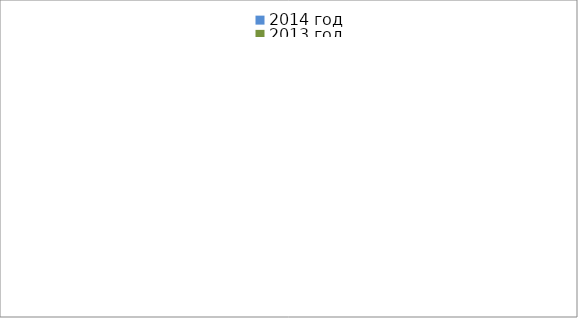
| Category | 2014 год | 2013 год |
|---|---|---|
|  - поджог | 17 | 31 |
|  - неосторожное обращение с огнём | 32 | 44 |
|  - НПТЭ электрооборудования | 17 | 20 |
|  - НПУ и Э печей | 53 | 40 |
|  - НПУ и Э транспортных средств | 49 | 51 |
|   -Шалость с огнем детей | 0 | 3 |
|  -НППБ при эксплуатации эл.приборов | 17 | 21 |
|  - курение | 17 | 11 |
| - прочие | 73 | 66 |
| - не установленные причины | 7 | 1 |